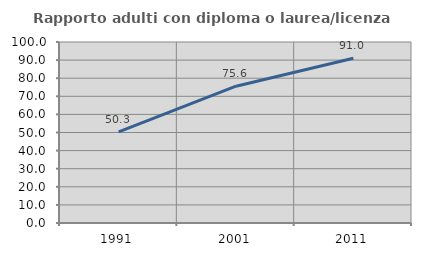
| Category | Rapporto adulti con diploma o laurea/licenza media  |
|---|---|
| 1991.0 | 50.341 |
| 2001.0 | 75.58 |
| 2011.0 | 91.011 |